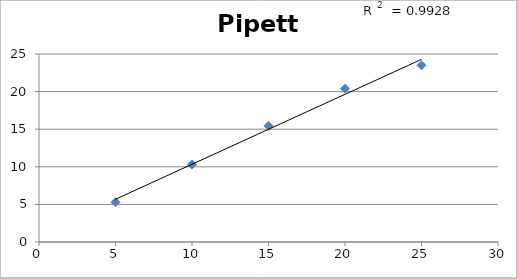
| Category | Mass of Water (g) |
|---|---|
| 5.0 | 5.29 |
| 10.0 | 10.3 |
| 15.0 | 15.45 |
| 20.0 | 20.39 |
| 25.0 | 23.5 |